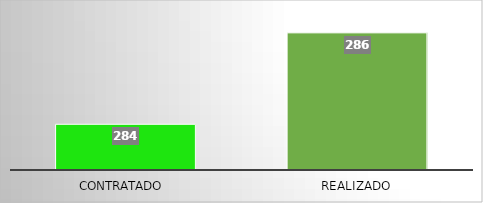
| Category | Series 0 |
|---|---|
| Contratado  | 284 |
| Realizado | 286 |